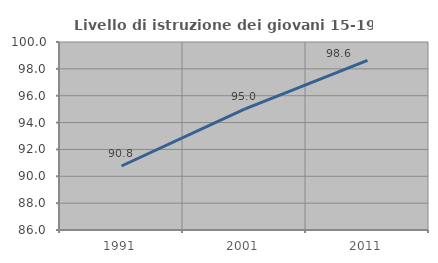
| Category | Livello di istruzione dei giovani 15-19 anni |
|---|---|
| 1991.0 | 90.766 |
| 2001.0 | 95 |
| 2011.0 | 98.639 |